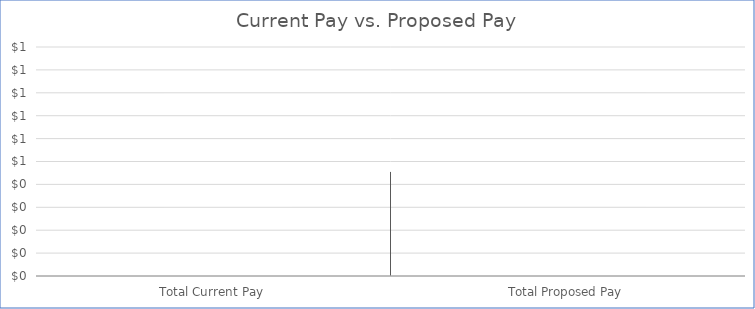
| Category | Series 0 |
|---|---|
| Total Current Pay | 0 |
| Total Proposed Pay | 0 |